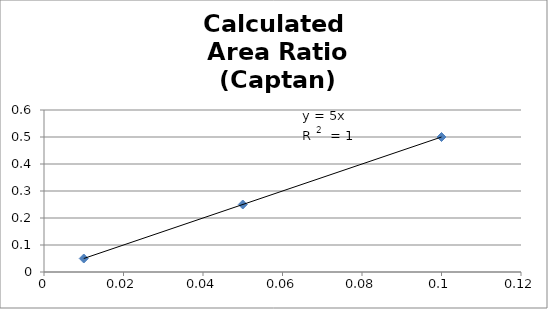
| Category | Calculated
 Area Ratio
 (Captan) |
|---|---|
| 0.01 | 0.05 |
| 0.05 | 0.25 |
| 0.1 | 0.5 |